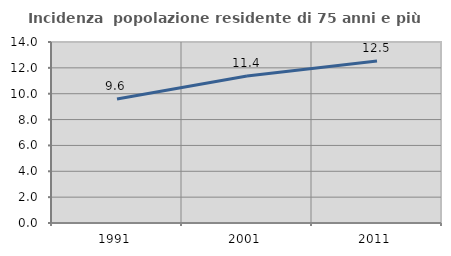
| Category | Incidenza  popolazione residente di 75 anni e più |
|---|---|
| 1991.0 | 9.589 |
| 2001.0 | 11.372 |
| 2011.0 | 12.526 |